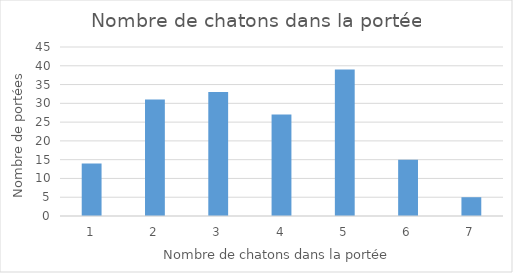
| Category | Series 0 |
|---|---|
| 1.0 | 14 |
| 2.0 | 31 |
| 3.0 | 33 |
| 4.0 | 27 |
| 5.0 | 39 |
| 6.0 | 15 |
| 7.0 | 5 |